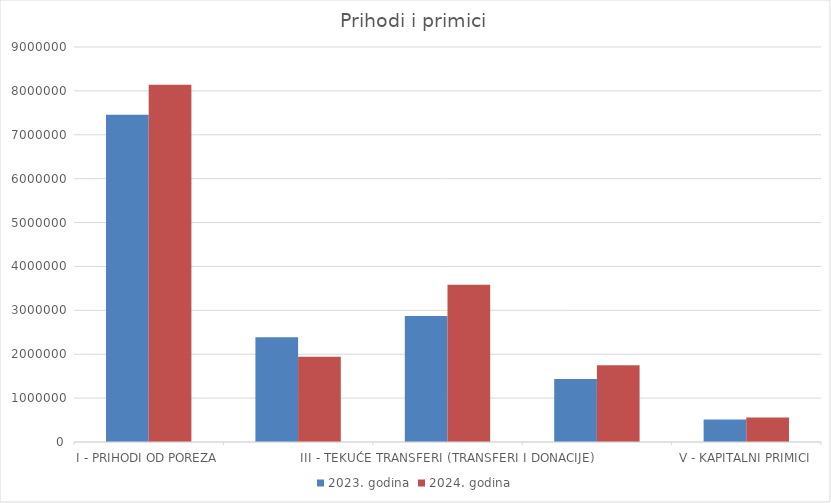
| Category | 2023. godina | 2024. godina |
|---|---|---|
| I - PRIHODI OD POREZA | 7456238 | 8142513 |
| II - NEPOREZNI PRIHODI | 2383960 | 1942644 |
| III - TEKUĆE TRANSFERI (TRANSFERI I DONACIJE) | 2869894 | 3581875 |
| IV - KAPITALNI TRANSFERI | 1436000 | 1750000 |
| V - KAPITALNI PRIMICI | 510000 | 560000 |